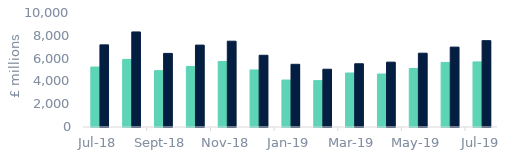
| Category | First-time
buyers | Homemovers |
|---|---|---|
| 2018-07-01 | 5260.792 | 7204.742 |
| 2018-08-01 | 5924.466 | 8339.223 |
| 2018-09-01 | 4943.534 | 6455.858 |
| 2018-10-01 | 5308.614 | 7184.217 |
| 2018-11-01 | 5745.931 | 7526.586 |
| 2018-12-01 | 5002.92 | 6292.124 |
| 2019-01-01 | 4119.983 | 5499.374 |
| 2019-02-01 | 4069.041 | 5068.178 |
| 2019-03-01 | 4736.622 | 5547.681 |
| 2019-04-01 | 4648.618 | 5688.304 |
| 2019-05-01 | 5130.396 | 6474.23 |
| 2019-06-01 | 5663.58 | 7008.424 |
| 2019-07-01 | 5708.927 | 7574.207 |